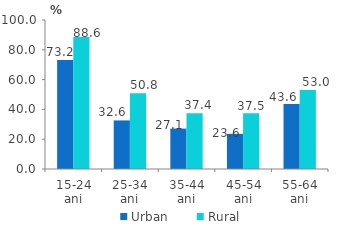
| Category | Urban | Rural |
|---|---|---|
| 15-24 ani | 73.2 | 88.6 |
| 25-34 ani | 32.6 | 50.8 |
| 35-44 ani | 27.1 | 37.4 |
| 45-54 ani | 23.6 | 37.5 |
| 55-64 ani | 43.6 | 53 |